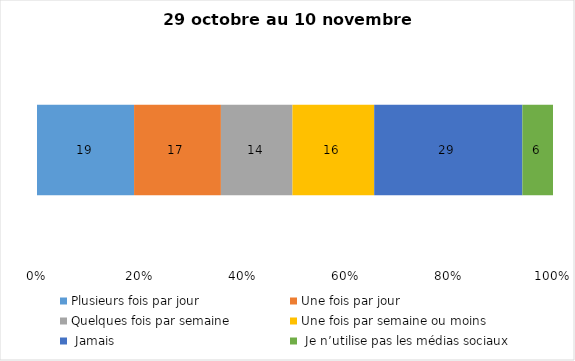
| Category | Plusieurs fois par jour | Une fois par jour | Quelques fois par semaine   | Une fois par semaine ou moins   |  Jamais   |  Je n’utilise pas les médias sociaux |
|---|---|---|---|---|---|---|
| 0 | 19 | 17 | 14 | 16 | 29 | 6 |